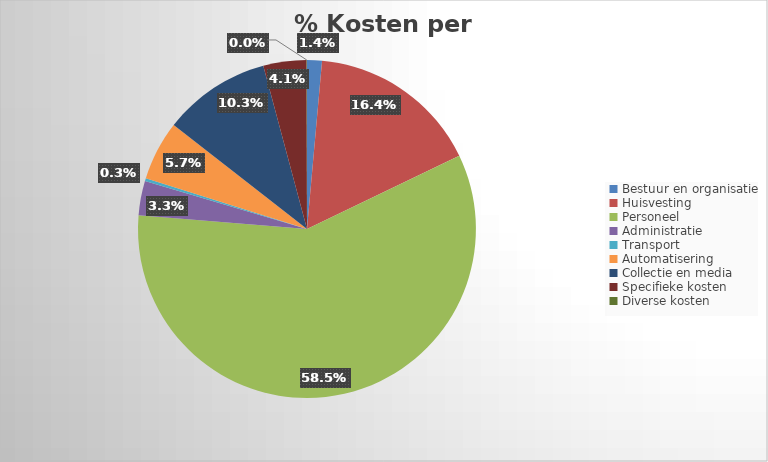
| Category | % Kosten per rubriek |
|---|---|
| Bestuur en organisatie | 0.014 |
| Huisvesting | 0.162 |
| Personeel | 0.577 |
| Administratie | 0.032 |
| Transport | 0.003 |
| Automatisering | 0.056 |
| Collectie en media | 0.102 |
| Specifieke kosten | 0.041 |
| Diverse kosten | 0 |